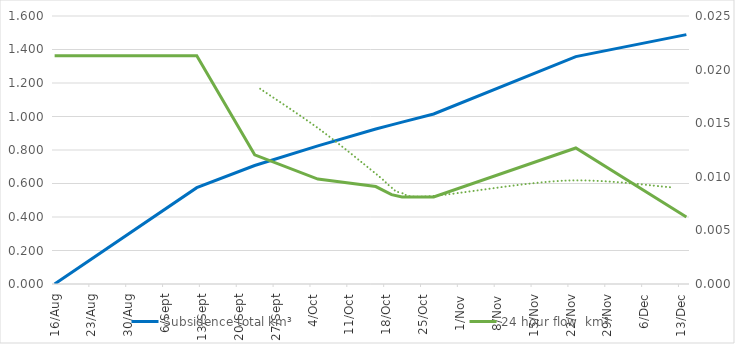
| Category | Subsidence total km³ |
|---|---|
| 2014-08-16 | 0 |
| 2014-09-12 | 0.575 |
| 2014-09-23 | 0.708 |
| 2014-10-05 | 0.825 |
| 2014-10-16 | 0.925 |
| 2014-10-19 | 0.95 |
| 2014-10-21 | 0.966 |
| 2014-10-27 | 1.015 |
| 2014-11-23 | 1.358 |
| 2014-12-14 | 1.489 |